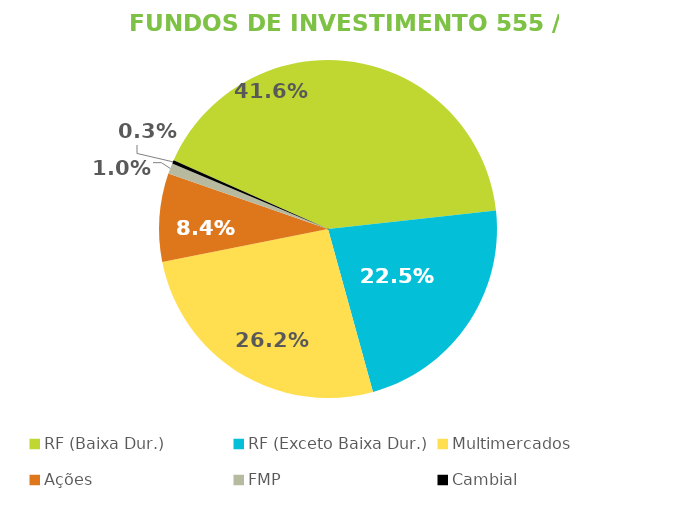
| Category | Fundos de Investimento 555 / FMP |
|---|---|
| RF (Baixa Dur.) | 0.416 |
| RF (Exceto Baixa Dur.) | 0.225 |
| Multimercados | 0.262 |
| Ações | 0.084 |
| FMP | 0.01 |
| Cambial | 0.003 |